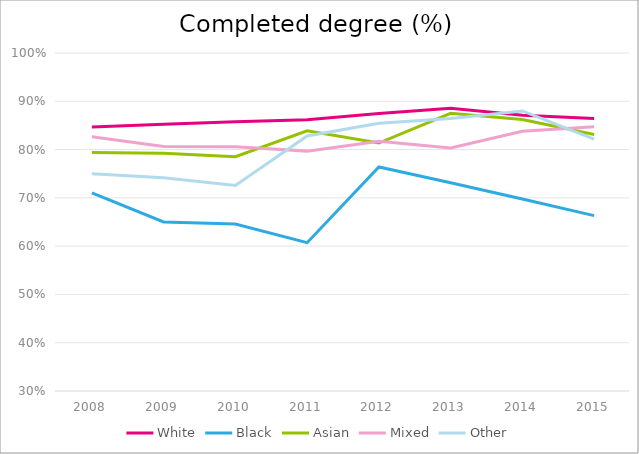
| Category | White | Black | Asian | Mixed | Other |
|---|---|---|---|---|---|
| 2008.0 | 0.847 | 0.711 | 0.794 | 0.826 | 0.75 |
| 2009.0 | 0.853 | 0.65 | 0.792 | 0.806 | 0.742 |
| 2010.0 | 0.858 | 0.646 | 0.785 | 0.806 | 0.726 |
| 2011.0 | 0.862 | 0.607 | 0.839 | 0.797 | 0.828 |
| 2012.0 | 0.875 | 0.764 | 0.813 | 0.817 | 0.855 |
| 2013.0 | 0.886 | 0.731 | 0.875 | 0.803 | 0.864 |
| 2014.0 | 0.871 | 0.698 | 0.862 | 0.838 | 0.88 |
| 2015.0 | 0.864 | 0.663 | 0.831 | 0.847 | 0.821 |